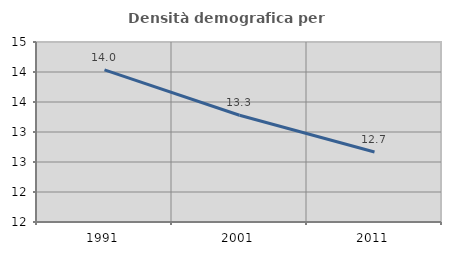
| Category | Densità demografica |
|---|---|
| 1991.0 | 14.035 |
| 2001.0 | 13.279 |
| 2011.0 | 12.667 |